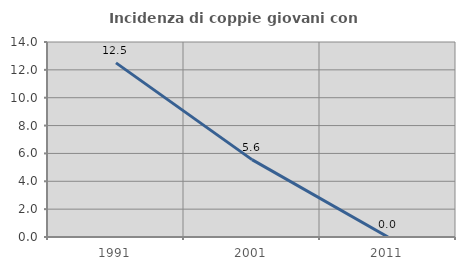
| Category | Incidenza di coppie giovani con figli |
|---|---|
| 1991.0 | 12.5 |
| 2001.0 | 5.556 |
| 2011.0 | 0 |